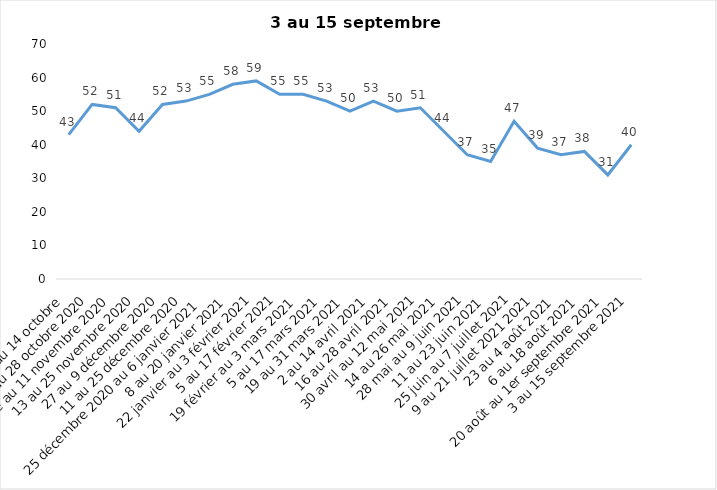
| Category | Toujours aux trois mesures |
|---|---|
| 2 au 14 octobre  | 43 |
| 16 au 28 octobre 2020 | 52 |
| 30 octobre au 11 novembre 2020 | 51 |
| 13 au 25 novembre 2020 | 44 |
| 27 au 9 décembre 2020 | 52 |
| 11 au 25 décembre 2020 | 53 |
| 25 décembre 2020 au 6 janvier 2021 | 55 |
| 8 au 20 janvier 2021 | 58 |
| 22 janvier au 3 février 2021 | 59 |
| 5 au 17 février 2021 | 55 |
| 19 février au 3 mars 2021 | 55 |
| 5 au 17 mars 2021 | 53 |
| 19 au 31 mars 2021 | 50 |
| 2 au 14 avril 2021 | 53 |
| 16 au 28 avril 2021 | 50 |
| 30 avril au 12 mai 2021 | 51 |
| 14 au 26 mai 2021 | 44 |
| 28 mai au 9 juin 2021 | 37 |
| 11 au 23 juin 2021 | 35 |
| 25 juin au 7 juillet 2021 | 47 |
| 9 au 21 juillet 2021 2021 | 39 |
| 23 au 4 août 2021 | 37 |
| 6 au 18 août 2021 | 38 |
| 20 août au 1er septembre 2021 | 31 |
| 3 au 15 septembre 2021 | 40 |